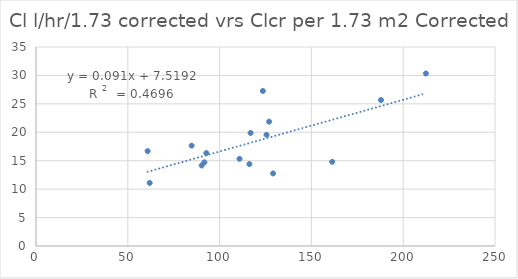
| Category | Series 0 |
|---|---|
| 123.57965899964714 | 27.264 |
| 92.76992632453738 | 16.344 |
| 110.8489872276171 | 15.333 |
| 60.79858488705896 | 16.69 |
| 84.76907691997363 | 17.656 |
| 90.25041753481428 | 14.169 |
| 91.72193546715404 | 14.72 |
| 212.37979989618796 | 30.342 |
| 116.89748648466197 | 19.884 |
| 187.91158075080716 | 25.673 |
| 126.97707293811686 | 21.866 |
| 116.20732051862358 | 14.409 |
| 161.31327792192252 | 14.805 |
| 61.92622152632369 | 11.091 |
| 129.13546543859258 | 12.76 |
| 125.5616583489329 | 19.568 |